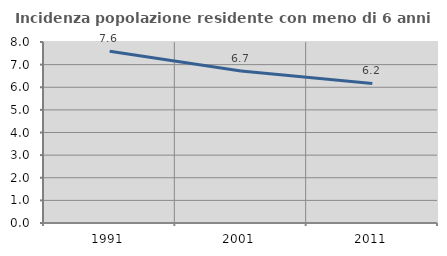
| Category | Incidenza popolazione residente con meno di 6 anni |
|---|---|
| 1991.0 | 7.589 |
| 2001.0 | 6.719 |
| 2011.0 | 6.166 |